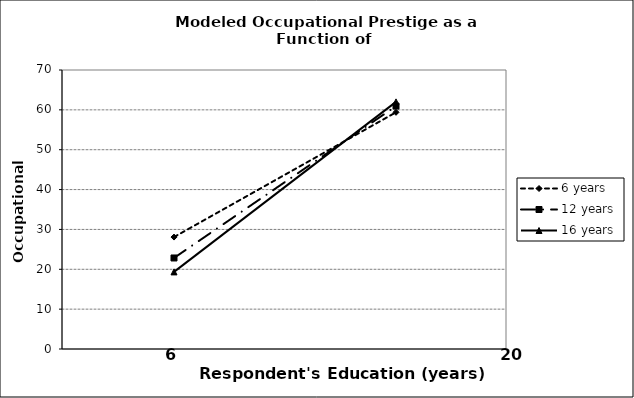
| Category | 6 years | 12 years | 16 years |
|---|---|---|---|
| 0 | 28.082 | 22.839 | 19.344 |
| 1 | 59.387 | 60.955 | 62 |